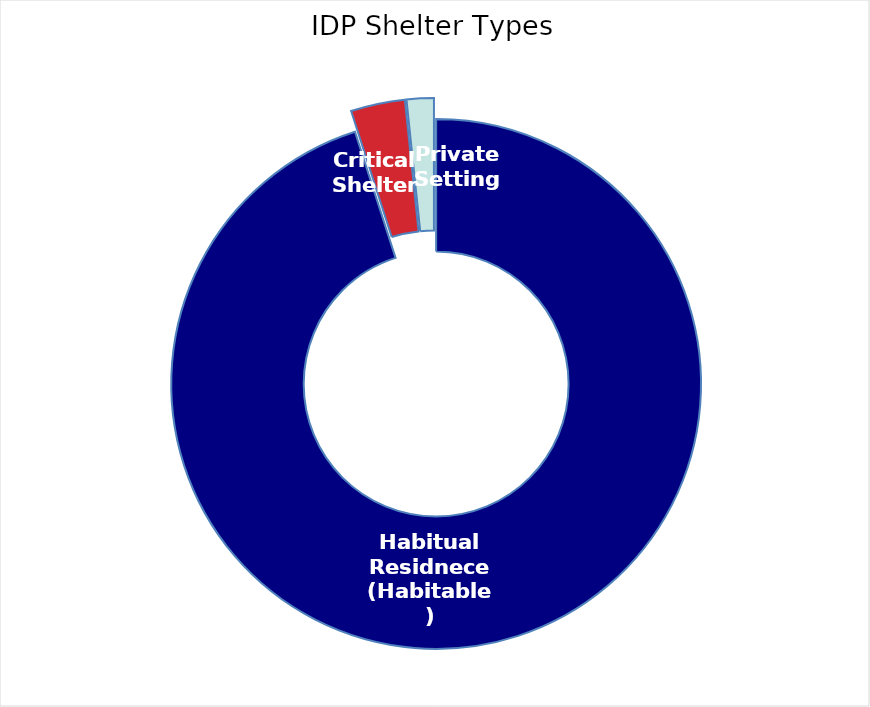
| Category | Families |
|---|---|
| Habitual Residnece (Habitable) | 728099 |
| Critical Shelter | 25295 |
| Private Setting | 12681 |